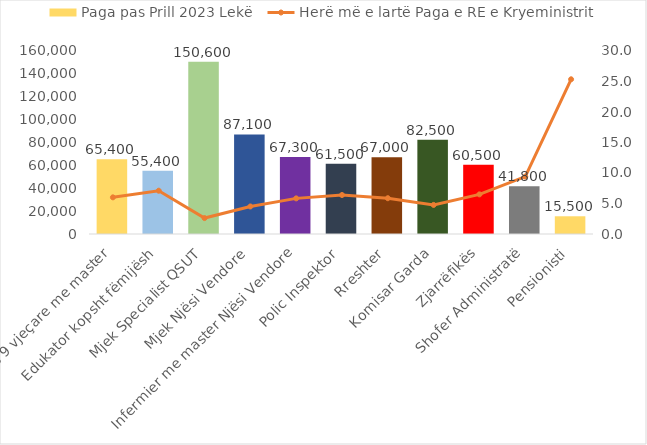
| Category | Paga pas Prill 2023 Lekë |
|---|---|
| Mësues 9 vjeçare me master | 65400 |
| Edukator kopsht fëmijësh | 55400 |
| Mjek Specialist QSUT | 150600 |
| Mjek Njësi Vendore | 87100 |
| Infermier me master Njësi Vendore | 67300 |
| Polic Inspektor | 61500 |
| Rreshter | 67000 |
| Komisar Garda | 82500 |
| Zjarrëfikës | 60500 |
| Shofer Administratë | 41800 |
| Pensionisti | 15500 |